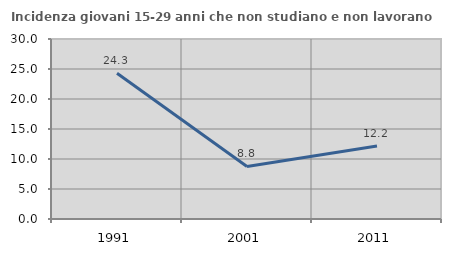
| Category | Incidenza giovani 15-29 anni che non studiano e non lavorano  |
|---|---|
| 1991.0 | 24.277 |
| 2001.0 | 8.756 |
| 2011.0 | 12.15 |